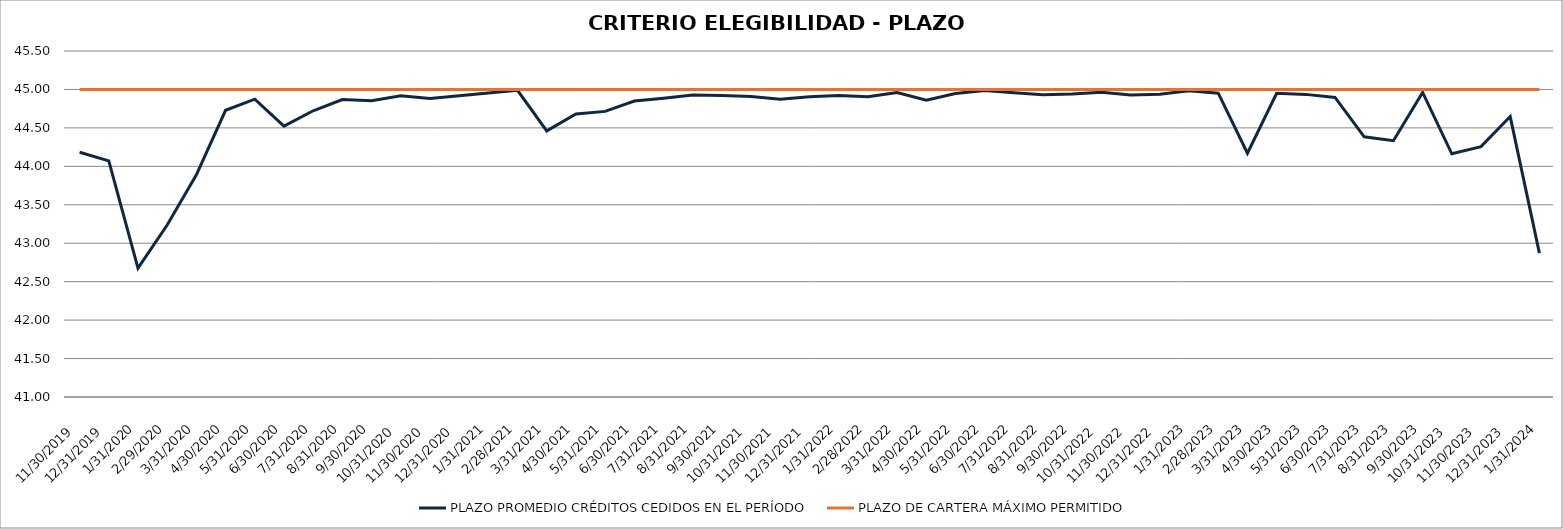
| Category | PLAZO PROMEDIO CRÉDITOS CEDIDOS EN EL PERÍODO | PLAZO DE CARTERA MÁXIMO PERMITIDO |
|---|---|---|
| 11/30/19 | 44.184 | 45 |
| 12/31/19 | 44.07 | 45 |
| 1/31/20 | 42.676 | 45 |
| 2/29/20 | 43.236 | 45 |
| 3/31/20 | 43.889 | 45 |
| 4/30/20 | 44.729 | 45 |
| 5/31/20 | 44.874 | 45 |
| 6/30/20 | 44.524 | 45 |
| 7/31/20 | 44.723 | 45 |
| 8/31/20 | 44.869 | 45 |
| 9/30/20 | 44.854 | 45 |
| 10/31/20 | 44.919 | 45 |
| 11/30/20 | 44.882 | 45 |
| 12/31/20 | 44.917 | 45 |
| 1/31/21 | 44.954 | 45 |
| 2/28/21 | 44.989 | 45 |
| 3/31/21 | 44.461 | 45 |
| 4/30/21 | 44.681 | 45 |
| 5/31/21 | 44.715 | 45 |
| 6/30/21 | 44.849 | 45 |
| 7/31/21 | 44.885 | 45 |
| 8/31/21 | 44.929 | 45 |
| 9/30/21 | 44.922 | 45 |
| 10/31/21 | 44.909 | 45 |
| 11/30/21 | 44.872 | 45 |
| 12/31/21 | 44.905 | 45 |
| 1/31/22 | 44.92 | 45 |
| 2/28/22 | 44.906 | 45 |
| 3/31/22 | 44.959 | 45 |
| 4/30/22 | 44.86 | 45 |
| 5/31/22 | 44.947 | 45 |
| 6/30/22 | 44.986 | 45 |
| 7/31/22 | 44.957 | 45 |
| 8/31/22 | 44.932 | 45 |
| 9/30/22 | 44.941 | 45 |
| 10/31/22 | 44.965 | 45 |
| 11/30/22 | 44.929 | 45 |
| 12/31/22 | 44.939 | 45 |
| 1/31/23 | 44.984 | 45 |
| 2/28/23 | 44.952 | 45 |
| 3/31/23 | 44.17 | 45 |
| 4/30/23 | 44.95 | 45 |
| 5/31/23 | 44.936 | 45 |
| 6/30/23 | 44.896 | 45 |
| 7/31/23 | 44.384 | 45 |
| 8/31/23 | 44.333 | 45 |
| 9/30/23 | 44.962 | 45 |
| 10/31/23 | 44.163 | 45 |
| 11/30/23 | 44.256 | 45 |
| 12/31/23 | 44.647 | 45 |
| 1/31/24 | 42.872 | 45 |